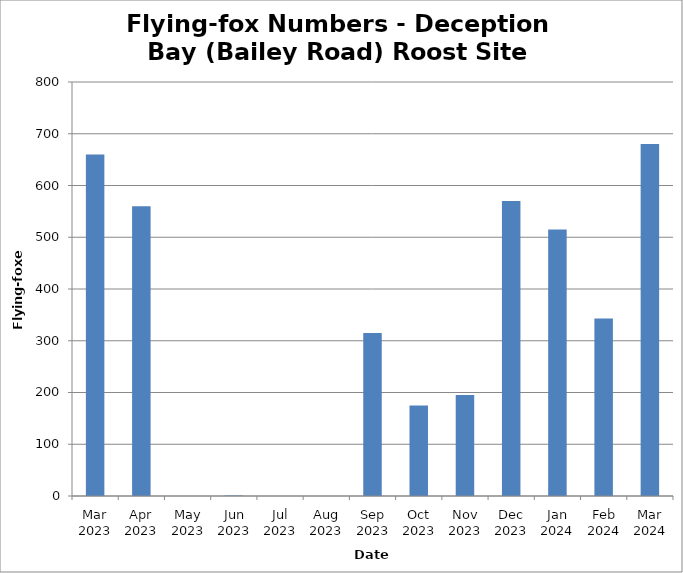
| Category | Flying-foxes |
|---|---|
| Mar 2023 | 660 |
| Apr 2023 | 560 |
| May 2023 | 0 |
| Jun 2023 | 1 |
| Jul 2023 | 0 |
| Aug 2023 | 0 |
| Sep 2023 | 315 |
| Oct 2023 | 175 |
| Nov 2023 | 195 |
| Dec 2023 | 570 |
| Jan 2024 | 515 |
| Feb 2024 | 343 |
| Mar 2024 | 680 |